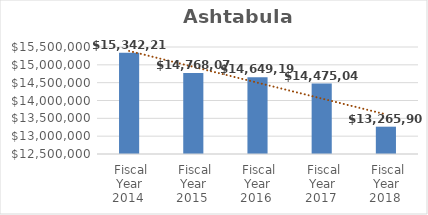
| Category | Ashtabula Campus |
|---|---|
| Fiscal Year 2014 | 15342216 |
| Fiscal Year 2015 | 14768074 |
| Fiscal Year 2016 | 14649190 |
| Fiscal Year 2017 | 14475044 |
| Fiscal Year 2018 | 13265906 |